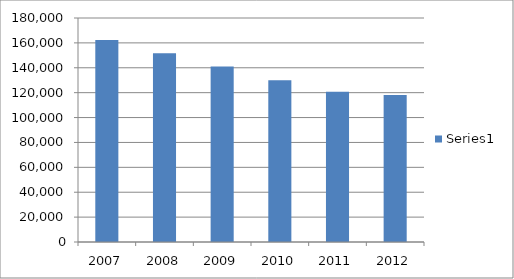
| Category | Series 0 |
|---|---|
| 2007.0 | 162317 |
| 2008.0 | 151621 |
| 2009.0 | 141123 |
| 2010.0 | 130062 |
| 2011.0 | 120823.28 |
| 2012.0 | 118221.54 |